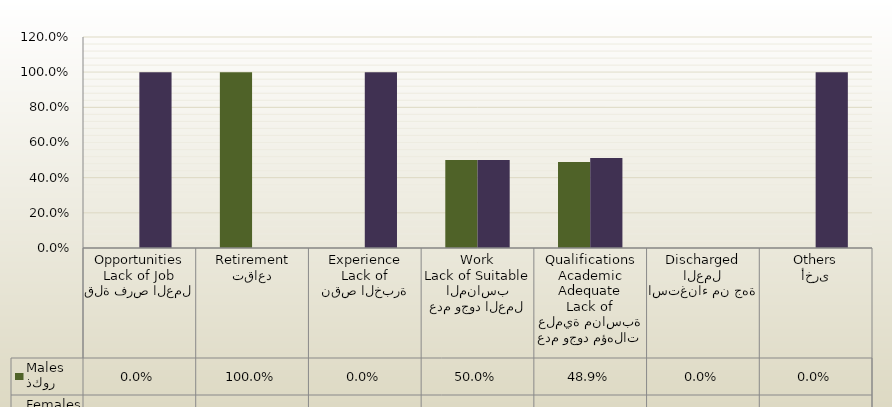
| Category | ذكور
Males | اناث
Females |
|---|---|---|
| قلة فرص العمل
Lack of Job Opportunities | 0 | 1 |
| تقاعد
Retirement | 1 | 0 |
| نقص الخبرة
Lack of Experience | 0 | 1 |
| عدم وجود العمل المناسب
Lack of Suitable Work | 0.5 | 0.5 |
| عدم وجود مؤهلات علمية مناسبة
Lack of Adequate Academic Qualifications | 0.489 | 0.511 |
| استغناء من جهة العمل
Discharged | 0 | 0 |
| أخرى
Others | 0 | 1 |